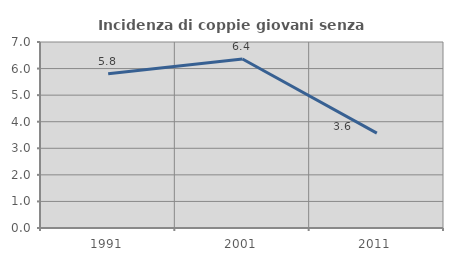
| Category | Incidenza di coppie giovani senza figli |
|---|---|
| 1991.0 | 5.805 |
| 2001.0 | 6.362 |
| 2011.0 | 3.571 |